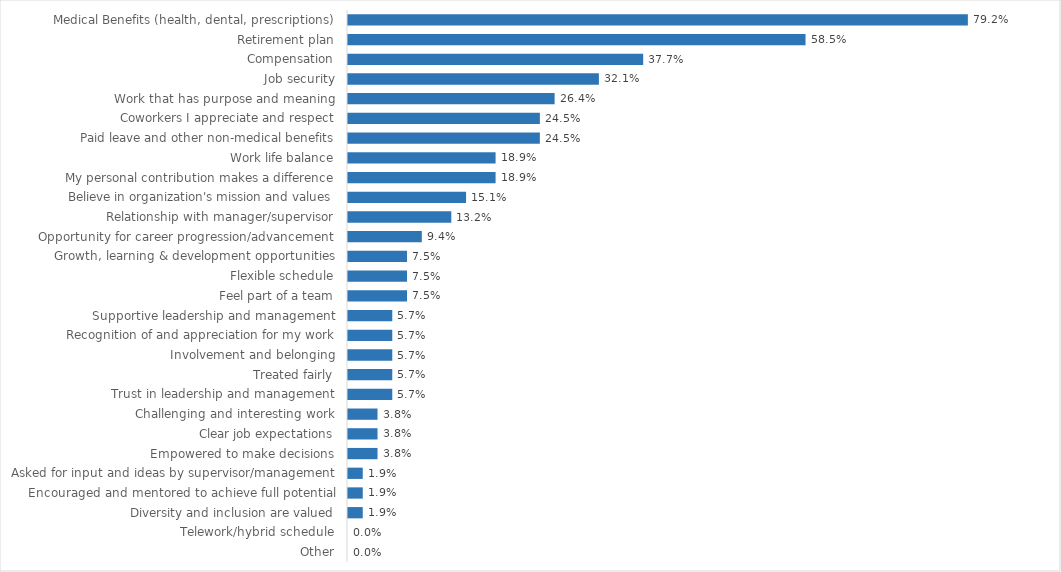
| Category | Vermont Veterans' Home |
|---|---|
| Medical Benefits (health, dental, prescriptions) | 0.792 |
| Retirement plan | 0.585 |
| Compensation | 0.377 |
| Job security | 0.321 |
| Work that has purpose and meaning | 0.264 |
| Coworkers I appreciate and respect | 0.245 |
| Paid leave and other non-medical benefits | 0.245 |
| Work life balance | 0.189 |
| My personal contribution makes a difference | 0.189 |
| Believe in organization's mission and values | 0.151 |
| Relationship with manager/supervisor | 0.132 |
| Opportunity for career progression/advancement | 0.094 |
| Growth, learning & development opportunities | 0.075 |
| Flexible schedule | 0.075 |
| Feel part of a team | 0.075 |
| Supportive leadership and management | 0.057 |
| Recognition of and appreciation for my work | 0.057 |
| Involvement and belonging | 0.057 |
| Treated fairly | 0.057 |
| Trust in leadership and management | 0.057 |
| Challenging and interesting work | 0.038 |
| Clear job expectations | 0.038 |
| Empowered to make decisions | 0.038 |
| Asked for input and ideas by supervisor/management | 0.019 |
| Encouraged and mentored to achieve full potential | 0.019 |
| Diversity and inclusion are valued | 0.019 |
| Telework/hybrid schedule | 0 |
| Other | 0 |